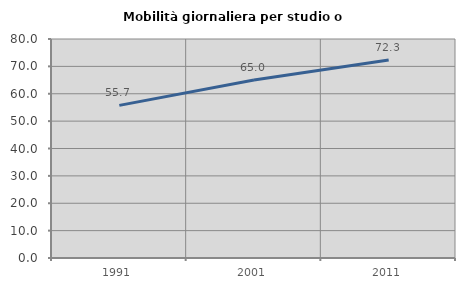
| Category | Mobilità giornaliera per studio o lavoro |
|---|---|
| 1991.0 | 55.748 |
| 2001.0 | 64.991 |
| 2011.0 | 72.339 |